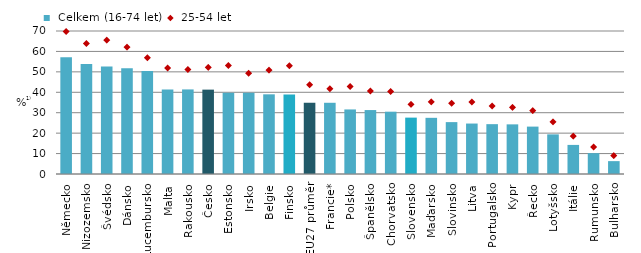
| Category |  Celkem (16-74 let) |
|---|---|
| Německo | 57.1 |
| Nizozemsko | 53.8 |
| Švédsko | 52.6 |
| Dánsko | 51.8 |
| Lucembursko | 50.4 |
| Malta | 41.4 |
| Rakousko | 41.4 |
| Česko | 41.3 |
| Estonsko | 39.8 |
| Irsko | 39.8 |
| Belgie | 39 |
| Finsko | 38.9 |
| EU27 průměr | 34.878 |
| Francie* | 34.864 |
| Polsko | 31.6 |
| Španělsko | 31.3 |
| Chorvatsko | 30.5 |
| Slovensko | 27.6 |
| Maďarsko | 27.5 |
| Slovinsko | 25.4 |
| Litva | 24.7 |
| Portugalsko | 24.4 |
| Kypr | 24.3 |
| Řecko | 23.2 |
| Lotyšsko | 19.4 |
| Itálie | 14.24 |
| Rumunsko | 10.2 |
| Bulharsko | 6.3 |